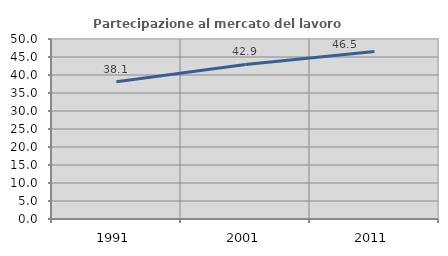
| Category | Partecipazione al mercato del lavoro  femminile |
|---|---|
| 1991.0 | 38.107 |
| 2001.0 | 42.917 |
| 2011.0 | 46.542 |